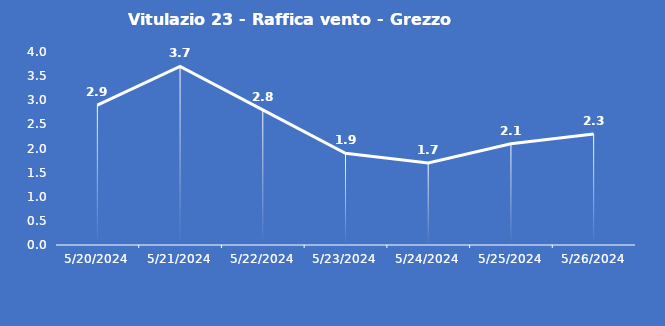
| Category | Vitulazio 23 - Raffica vento - Grezzo (m/s) |
|---|---|
| 5/20/24 | 2.9 |
| 5/21/24 | 3.7 |
| 5/22/24 | 2.8 |
| 5/23/24 | 1.9 |
| 5/24/24 | 1.7 |
| 5/25/24 | 2.1 |
| 5/26/24 | 2.3 |